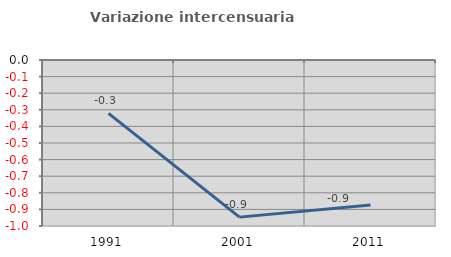
| Category | Variazione intercensuaria annua |
|---|---|
| 1991.0 | -0.322 |
| 2001.0 | -0.947 |
| 2011.0 | -0.874 |